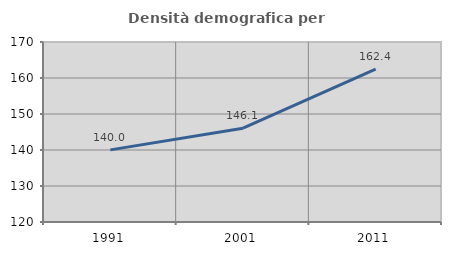
| Category | Densità demografica |
|---|---|
| 1991.0 | 140.036 |
| 2001.0 | 146.063 |
| 2011.0 | 162.442 |